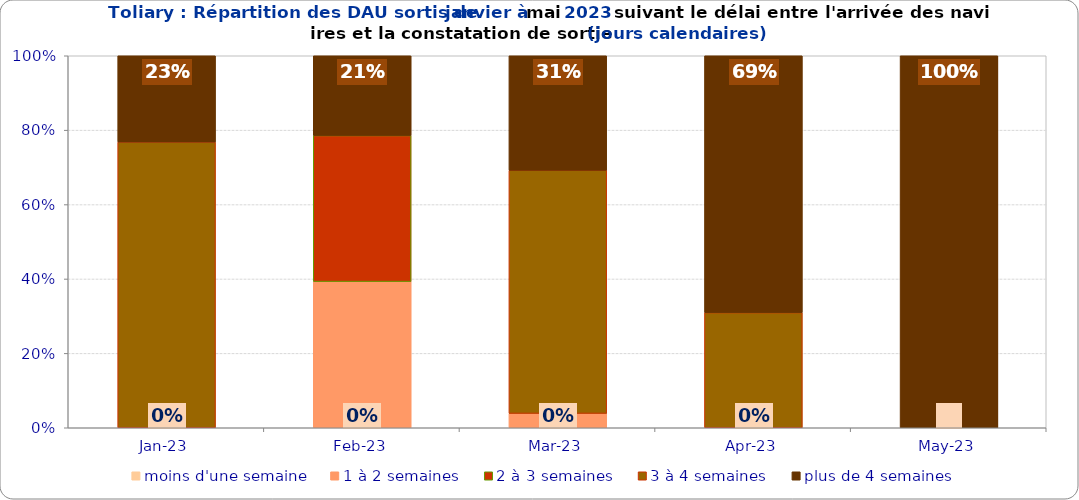
| Category | moins d'une semaine | 1 à 2 semaines | 2 à 3 semaines | 3 à 4 semaines | plus de 4 semaines |
|---|---|---|---|---|---|
| 2023-01-01 | 0 | 0 | 0 | 0.768 | 0.232 |
| 2023-02-01 | 0 | 0.393 | 0.393 | 0 | 0.214 |
| 2023-03-01 | 0 | 0.038 | 0 | 0.654 | 0.308 |
| 2023-04-01 | 0 | 0 | 0 | 0.31 | 0.69 |
| 2023-05-01 | 0 | 0 | 0 | 0 | 1 |